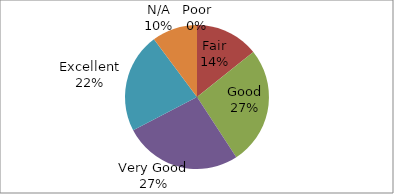
| Category | Series 0 |
|---|---|
| Poor | 0 |
| Fair | 7 |
| Good | 13 |
| Very Good | 13 |
| Excellent | 11 |
| N/A | 5 |